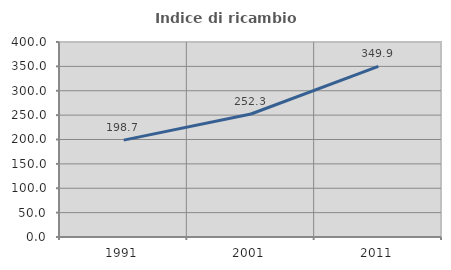
| Category | Indice di ricambio occupazionale  |
|---|---|
| 1991.0 | 198.714 |
| 2001.0 | 252.321 |
| 2011.0 | 349.903 |